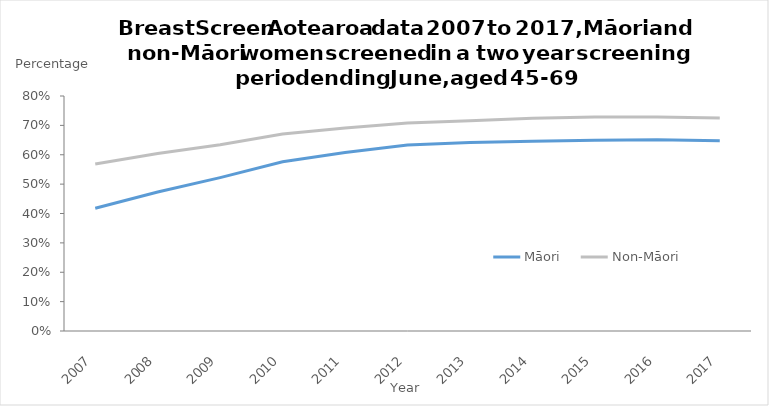
| Category | Year | Māori | Non-Māori |
|---|---|---|---|
| 2007.0 | 2007 | 0.418 | 0.568 |
| 2008.0 | 2008 | 0.473 | 0.604 |
| 2009.0 | 2009 | 0.522 | 0.634 |
| 2010.0 | 2010 | 0.576 | 0.671 |
| 2011.0 | 2011 | 0.607 | 0.691 |
| 2012.0 | 2012 | 0.633 | 0.708 |
| 2013.0 | 2013 | 0.641 | 0.715 |
| 2014.0 | 2014 | 0.646 | 0.724 |
| 2015.0 | 2015 | 0.65 | 0.729 |
| 2016.0 | 2016 | 0.651 | 0.728 |
| 2017.0 | 2017 | 0.648 | 0.725 |